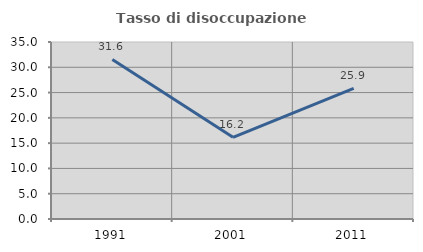
| Category | Tasso di disoccupazione giovanile  |
|---|---|
| 1991.0 | 31.553 |
| 2001.0 | 16.154 |
| 2011.0 | 25.85 |